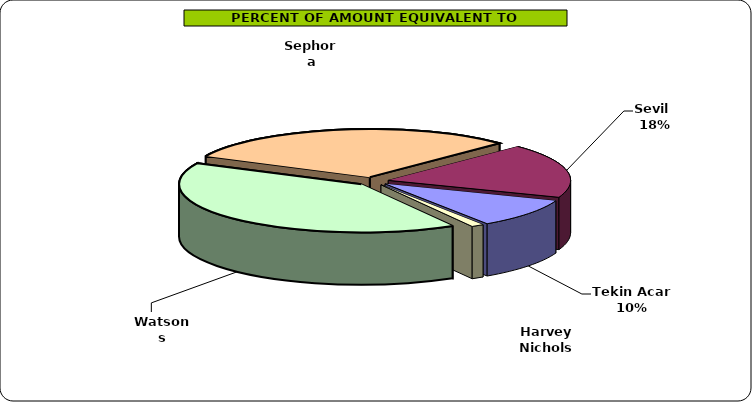
| Category | Series 0 |
|---|---|
| Watsons | 619765.769 |
| Sephora | 464582.615 |
| Sevil  | 277163.077 |
| Tekin Acar  | 150169.231 |
| Harvey Nichols | 17096 |